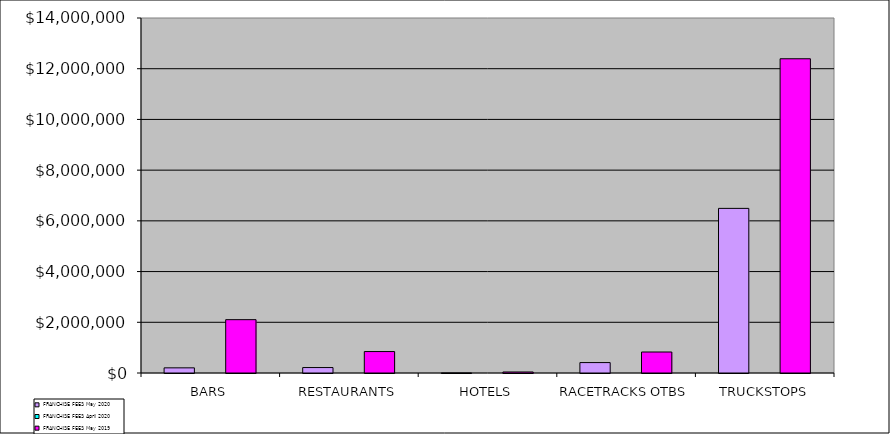
| Category | FRANCHISE FEES |
|---|---|
| BARS | 2103255 |
| RESTAURANTS | 845713 |
| HOTELS | 40664 |
| RACETRACKS OTBS | 828060 |
| TRUCKSTOPS | 12392392 |